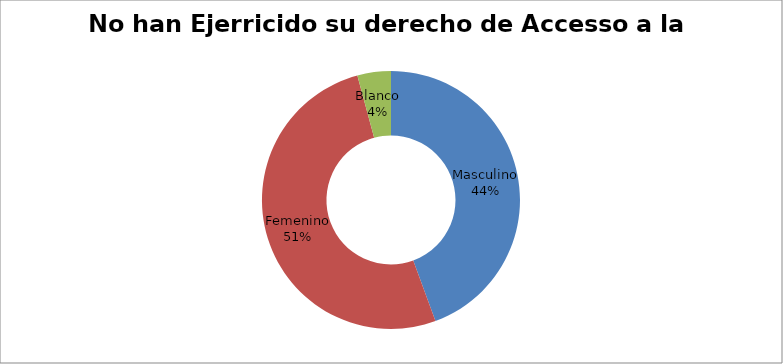
| Category | Series 0 |
|---|---|
| Masculino | 0.444 |
| Femenino | 0.514 |
| Blanco | 0.042 |